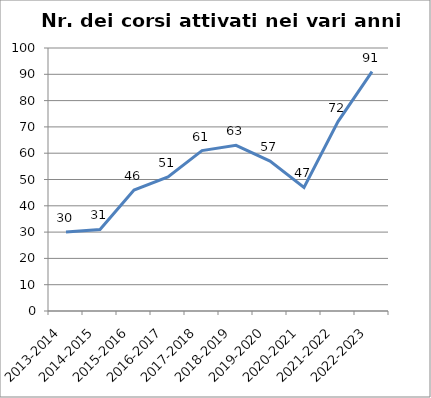
| Category | Nr. Corsi Attivati |
|---|---|
| 2013-2014 | 30 |
| 2014-2015 | 31 |
| 2015-2016 | 46 |
| 2016-2017 | 51 |
| 2017-2018 | 61 |
| 2018-2019 | 63 |
| 2019-2020 | 57 |
| 2020-2021 | 47 |
| 2021-2022 | 72 |
| 2022-2023 | 91 |